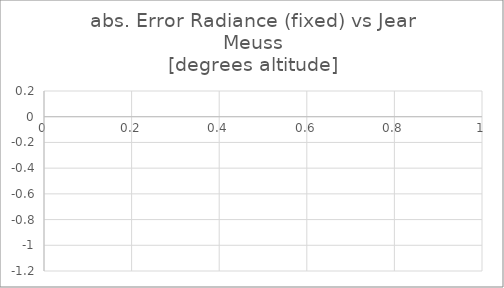
| Category | Series 1 |
|---|---|
| 0 | -0.018 |
| 1 | -0.019 |
| 2 | -0.021 |
| 3 | -0.023 |
| 4 | -0.027 |
| 5 | -0.031 |
| 6 | -0.036 |
| 7 | -0.042 |
| 8 | -0.048 |
| 9 | -0.056 |
| 10 | -0.065 |
| 11 | -0.076 |
| 12 | -0.087 |
| 13 | -0.099 |
| 14 | -0.11 |
| 15 | -0.124 |
| 16 | -0.137 |
| 17 | -0.151 |
| 18 | -0.166 |
| 19 | -0.181 |
| 20 | -0.197 |
| 21 | -0.213 |
| 22 | -0.23 |
| 23 | -0.248 |
| 24 | -0.266 |
| 25 | -0.284 |
| 26 | -0.303 |
| 27 | -0.322 |
| 28 | -0.341 |
| 29 | -0.361 |
| 30 | -0.38 |
| 31 | -0.4 |
| 32 | -0.421 |
| 33 | -0.441 |
| 34 | -0.461 |
| 35 | -0.482 |
| 36 | -0.502 |
| 37 | -0.522 |
| 38 | -0.543 |
| 39 | -0.564 |
| 40 | -0.583 |
| 41 | -0.604 |
| 42 | -0.623 |
| 43 | -0.643 |
| 44 | -0.662 |
| 45 | -0.681 |
| 46 | -0.7 |
| 47 | -0.719 |
| 48 | -0.737 |
| 49 | -0.754 |
| 50 | -0.771 |
| 51 | -0.788 |
| 52 | -0.804 |
| 53 | -0.82 |
| 54 | -0.835 |
| 55 | -0.849 |
| 56 | -0.862 |
| 57 | -0.876 |
| 58 | -0.888 |
| 59 | -0.9 |
| 60 | -0.911 |
| 61 | -0.922 |
| 62 | -0.931 |
| 63 | -0.94 |
| 64 | -0.949 |
| 65 | -0.957 |
| 66 | -0.963 |
| 67 | -0.969 |
| 68 | -0.975 |
| 69 | -0.98 |
| 70 | -0.984 |
| 71 | -0.988 |
| 72 | -0.99 |
| 73 | -0.992 |
| 74 | -0.994 |
| 75 | -0.993 |
| 76 | -0.994 |
| 77 | -0.993 |
| 78 | -0.991 |
| 79 | -0.989 |
| 80 | -0.986 |
| 81 | -0.983 |
| 82 | -0.979 |
| 83 | -0.973 |
| 84 | -0.968 |
| 85 | -0.962 |
| 86 | -0.956 |
| 87 | -0.949 |
| 88 | -0.941 |
| 89 | -0.933 |
| 90 | -0.923 |
| 91 | -0.915 |
| 92 | -0.904 |
| 93 | -0.894 |
| 94 | -0.884 |
| 95 | -0.873 |
| 96 | -0.862 |
| 97 | -0.849 |
| 98 | -0.838 |
| 99 | -0.825 |
| 100 | -0.813 |
| 101 | -0.8 |
| 102 | -0.787 |
| 103 | -0.774 |
| 104 | -0.76 |
| 105 | -0.748 |
| 106 | -0.734 |
| 107 | -0.72 |
| 108 | -0.706 |
| 109 | -0.692 |
| 110 | -0.678 |
| 111 | -0.663 |
| 112 | -0.649 |
| 113 | -0.635 |
| 114 | -0.621 |
| 115 | -0.606 |
| 116 | -0.591 |
| 117 | -0.578 |
| 118 | -0.564 |
| 119 | -0.549 |
| 120 | -0.535 |
| 121 | -0.521 |
| 122 | -0.507 |
| 123 | -0.493 |
| 124 | -0.48 |
| 125 | -0.466 |
| 126 | -0.453 |
| 127 | -0.44 |
| 128 | -0.427 |
| 129 | -0.415 |
| 130 | -0.402 |
| 131 | -0.389 |
| 132 | -0.377 |
| 133 | -0.366 |
| 134 | -0.354 |
| 135 | -0.342 |
| 136 | -0.331 |
| 137 | -0.32 |
| 138 | -0.309 |
| 139 | -0.299 |
| 140 | -0.289 |
| 141 | -0.278 |
| 142 | -0.269 |
| 143 | -0.258 |
| 144 | -0.249 |
| 145 | -0.24 |
| 146 | -0.231 |
| 147 | -0.222 |
| 148 | -0.213 |
| 149 | -0.205 |
| 150 | -0.196 |
| 151 | -0.188 |
| 152 | -0.18 |
| 153 | -0.171 |
| 154 | -0.163 |
| 155 | -0.156 |
| 156 | -0.148 |
| 157 | -0.141 |
| 158 | -0.134 |
| 159 | -0.126 |
| 160 | -0.119 |
| 161 | -0.112 |
| 162 | -0.106 |
| 163 | -0.099 |
| 164 | -0.092 |
| 165 | -0.085 |
| 166 | -0.079 |
| 167 | -0.073 |
| 168 | -0.066 |
| 169 | -0.06 |
| 170 | -0.054 |
| 171 | -0.048 |
| 172 | -0.041 |
| 173 | -0.036 |
| 174 | -0.029 |
| 175 | -0.023 |
| 176 | -0.017 |
| 177 | -0.011 |
| 178 | -0.005 |
| 179 | 0.001 |
| 180 | 0.007 |
| 181 | 0.013 |
| 182 | 0.019 |
| 183 | 0.024 |
| 184 | 0.029 |
| 185 | 0.035 |
| 186 | 0.041 |
| 187 | 0.046 |
| 188 | 0.052 |
| 189 | 0.057 |
| 190 | 0.062 |
| 191 | 0.067 |
| 192 | 0.072 |
| 193 | 0.076 |
| 194 | 0.08 |
| 195 | 0.085 |
| 196 | 0.089 |
| 197 | 0.093 |
| 198 | 0.097 |
| 199 | 0.101 |
| 200 | 0.104 |
| 201 | 0.107 |
| 202 | 0.11 |
| 203 | 0.112 |
| 204 | 0.114 |
| 205 | 0.116 |
| 206 | 0.117 |
| 207 | 0.119 |
| 208 | 0.119 |
| 209 | 0.12 |
| 210 | 0.12 |
| 211 | 0.119 |
| 212 | 0.119 |
| 213 | 0.118 |
| 214 | 0.117 |
| 215 | 0.115 |
| 216 | 0.112 |
| 217 | 0.109 |
| 218 | 0.106 |
| 219 | 0.104 |
| 220 | 0.099 |
| 221 | 0.094 |
| 222 | 0.09 |
| 223 | 0.085 |
| 224 | 0.079 |
| 225 | 0.072 |
| 226 | 0.066 |
| 227 | 0.058 |
| 228 | 0.05 |
| 229 | 0.043 |
| 230 | 0.034 |
| 231 | 0.025 |
| 232 | 0.015 |
| 233 | 0.006 |
| 234 | -0.005 |
| 235 | -0.016 |
| 236 | -0.027 |
| 237 | -0.039 |
| 238 | -0.051 |
| 239 | -0.064 |
| 240 | -0.077 |
| 241 | -0.091 |
| 242 | -0.104 |
| 243 | -0.119 |
| 244 | -0.133 |
| 245 | -0.147 |
| 246 | -0.163 |
| 247 | -0.178 |
| 248 | -0.194 |
| 249 | -0.21 |
| 250 | -0.226 |
| 251 | -0.242 |
| 252 | -0.258 |
| 253 | -0.275 |
| 254 | -0.292 |
| 255 | -0.308 |
| 256 | -0.326 |
| 257 | -0.343 |
| 258 | -0.36 |
| 259 | -0.378 |
| 260 | -0.394 |
| 261 | -0.412 |
| 262 | -0.429 |
| 263 | -0.447 |
| 264 | -0.463 |
| 265 | -0.481 |
| 266 | -0.498 |
| 267 | -0.515 |
| 268 | -0.531 |
| 269 | -0.548 |
| 270 | -0.564 |
| 271 | -0.58 |
| 272 | -0.596 |
| 273 | -0.612 |
| 274 | -0.627 |
| 275 | -0.641 |
| 276 | -0.655 |
| 277 | -0.669 |
| 278 | -0.682 |
| 279 | -0.695 |
| 280 | -0.707 |
| 281 | -0.719 |
| 282 | -0.73 |
| 283 | -0.741 |
| 284 | -0.751 |
| 285 | -0.76 |
| 286 | -0.769 |
| 287 | -0.777 |
| 288 | -0.785 |
| 289 | -0.792 |
| 290 | -0.798 |
| 291 | -0.804 |
| 292 | -0.808 |
| 293 | -0.812 |
| 294 | -0.816 |
| 295 | -0.818 |
| 296 | -0.82 |
| 297 | -0.821 |
| 298 | -0.822 |
| 299 | -0.822 |
| 300 | -0.82 |
| 301 | -0.818 |
| 302 | -0.816 |
| 303 | -0.812 |
| 304 | -0.808 |
| 305 | -0.803 |
| 306 | -0.796 |
| 307 | -0.79 |
| 308 | -0.783 |
| 309 | -0.775 |
| 310 | -0.766 |
| 311 | -0.756 |
| 312 | -0.746 |
| 313 | -0.735 |
| 314 | -0.724 |
| 315 | -0.711 |
| 316 | -0.699 |
| 317 | -0.686 |
| 318 | -0.671 |
| 319 | -0.657 |
| 320 | -0.642 |
| 321 | -0.627 |
| 322 | -0.611 |
| 323 | -0.595 |
| 324 | -0.578 |
| 325 | -0.561 |
| 326 | -0.544 |
| 327 | -0.527 |
| 328 | -0.509 |
| 329 | -0.491 |
| 330 | -0.473 |
| 331 | -0.455 |
| 332 | -0.437 |
| 333 | -0.418 |
| 334 | -0.4 |
| 335 | -0.381 |
| 336 | -0.363 |
| 337 | -0.345 |
| 338 | -0.326 |
| 339 | -0.309 |
| 340 | -0.291 |
| 341 | -0.273 |
| 342 | -0.256 |
| 343 | -0.239 |
| 344 | -0.223 |
| 345 | -0.207 |
| 346 | -0.191 |
| 347 | -0.176 |
| 348 | -0.162 |
| 349 | -0.147 |
| 350 | -0.134 |
| 351 | -0.12 |
| 352 | -0.108 |
| 353 | -0.097 |
| 354 | -0.086 |
| 355 | -0.076 |
| 356 | -0.067 |
| 357 | -0.058 |
| 358 | -0.05 |
| 359 | -0.043 |
| 360 | -0.036 |
| 361 | -0.031 |
| 362 | -0.026 |
| 363 | -0.023 |
| 364 | -0.019 |